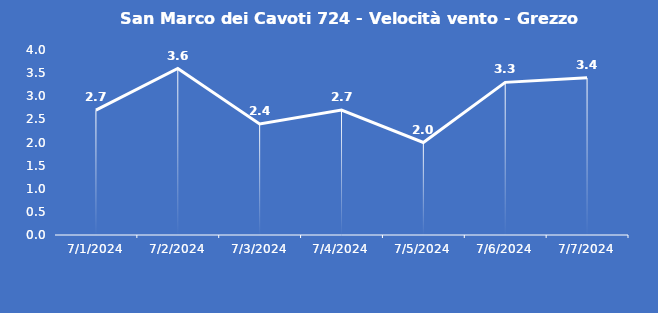
| Category | San Marco dei Cavoti 724 - Velocità vento - Grezzo (m/s) |
|---|---|
| 7/1/24 | 2.7 |
| 7/2/24 | 3.6 |
| 7/3/24 | 2.4 |
| 7/4/24 | 2.7 |
| 7/5/24 | 2 |
| 7/6/24 | 3.3 |
| 7/7/24 | 3.4 |